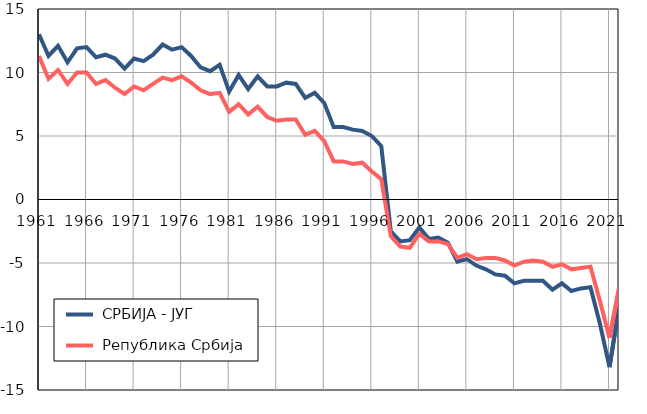
| Category |  СРБИЈА - ЈУГ |  Република Србија |
|---|---|---|
| 1961.0 | 13 | 11.3 |
| 1962.0 | 11.3 | 9.5 |
| 1963.0 | 12.1 | 10.2 |
| 1964.0 | 10.8 | 9.1 |
| 1965.0 | 11.9 | 10 |
| 1966.0 | 12 | 10 |
| 1967.0 | 11.2 | 9.1 |
| 1968.0 | 11.4 | 9.4 |
| 1969.0 | 11.1 | 8.8 |
| 1970.0 | 10.3 | 8.3 |
| 1971.0 | 11.1 | 8.9 |
| 1972.0 | 10.9 | 8.6 |
| 1973.0 | 11.4 | 9.1 |
| 1974.0 | 12.2 | 9.6 |
| 1975.0 | 11.8 | 9.4 |
| 1976.0 | 12 | 9.7 |
| 1977.0 | 11.3 | 9.2 |
| 1978.0 | 10.4 | 8.6 |
| 1979.0 | 10.1 | 8.3 |
| 1980.0 | 10.6 | 8.4 |
| 1981.0 | 8.5 | 6.9 |
| 1982.0 | 9.8 | 7.5 |
| 1983.0 | 8.7 | 6.7 |
| 1984.0 | 9.7 | 7.3 |
| 1985.0 | 8.9 | 6.5 |
| 1986.0 | 8.9 | 6.2 |
| 1987.0 | 9.2 | 6.3 |
| 1988.0 | 9.1 | 6.3 |
| 1989.0 | 8 | 5.1 |
| 1990.0 | 8.4 | 5.4 |
| 1991.0 | 7.6 | 4.6 |
| 1992.0 | 5.7 | 3 |
| 1993.0 | 5.7 | 3 |
| 1994.0 | 5.5 | 2.8 |
| 1995.0 | 5.4 | 2.9 |
| 1996.0 | 5 | 2.2 |
| 1997.0 | 4.2 | 1.6 |
| 1998.0 | -2.5 | -2.9 |
| 1999.0 | -3.3 | -3.7 |
| 2000.0 | -3.2 | -3.8 |
| 2001.0 | -2.2 | -2.7 |
| 2002.0 | -3.1 | -3.3 |
| 2003.0 | -3 | -3.3 |
| 2004.0 | -3.4 | -3.5 |
| 2005.0 | -4.9 | -4.6 |
| 2006.0 | -4.7 | -4.3 |
| 2007.0 | -5.2 | -4.7 |
| 2008.0 | -5.5 | -4.6 |
| 2009.0 | -5.9 | -4.6 |
| 2010.0 | -6 | -4.8 |
| 2011.0 | -6.6 | -5.2 |
| 2012.0 | -6.4 | -4.9 |
| 2013.0 | -6.4 | -4.8 |
| 2014.0 | -6.4 | -4.9 |
| 2015.0 | -7.1 | -5.3 |
| 2016.0 | -6.6 | -5.1 |
| 2017.0 | -7.2 | -5.5 |
| 2018.0 | -7 | -5.4 |
| 2019.0 | -6.9 | -5.3 |
| 2020.0 | -9.8 | -8 |
| 2021.0 | -13.2 | -10.9 |
| 2022.0 | -8.5 | -7 |